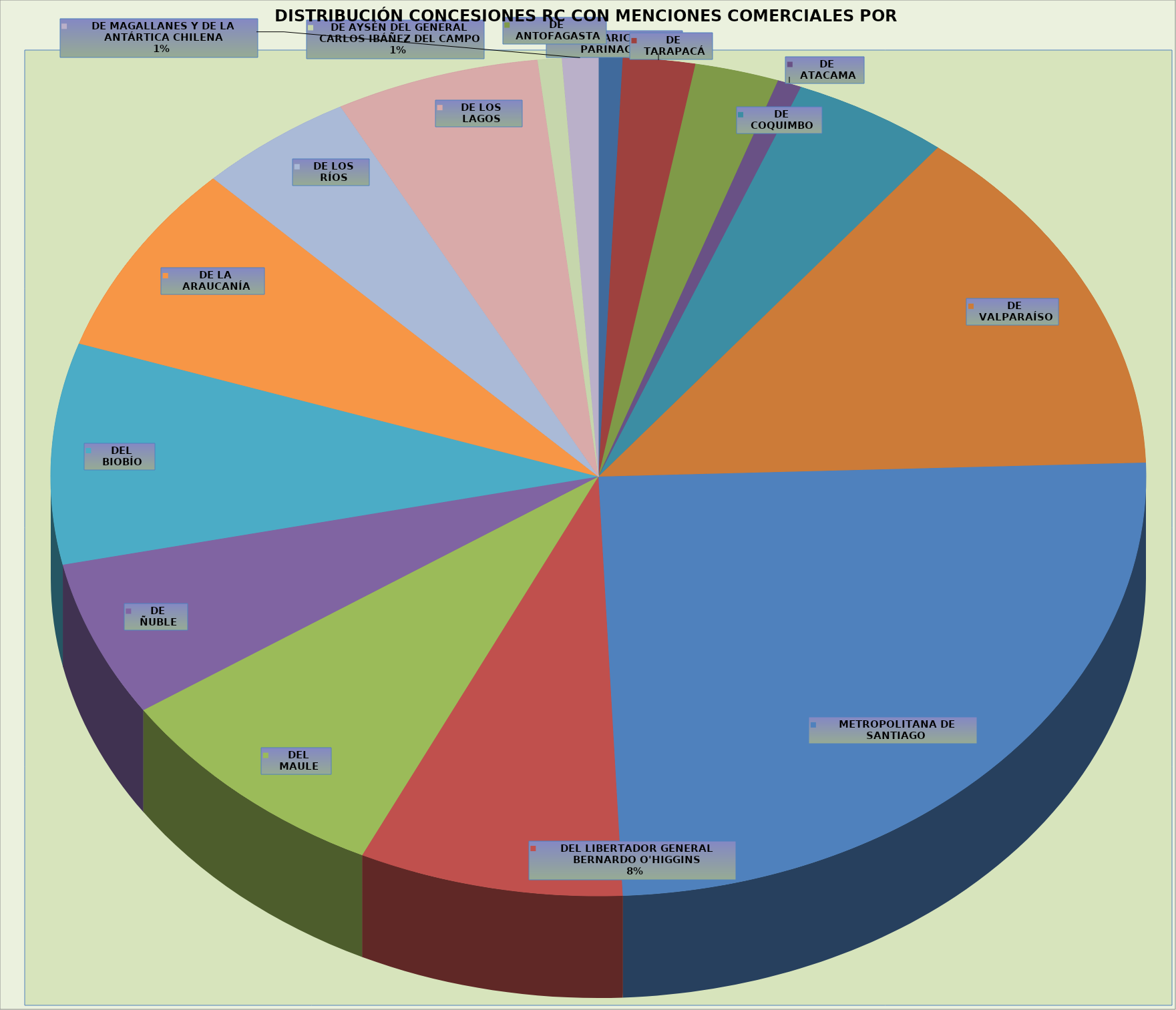
| Category | Total |
|---|---|
| DE ARICA Y PARINACOTA | 2 |
| DE TARAPACÁ | 6 |
| DE ANTOFAGASTA | 7 |
| DE ATACAMA | 2 |
| DE COQUIMBO | 13 |
| DE VALPARAÍSO | 39 |
| METROPOLITANA DE SANTIAGO | 70 |
| DEL LIBERTADOR GENERAL BERNARDO O'HIGGINS | 22 |
| DEL MAULE | 24 |
| DE ÑUBLE | 17 |
| DEL BIOBÍO | 24 |
| DE LA ARAUCANÍA | 21 |
| DE LOS RÍOS | 13 |
| DE LOS LAGOS | 17 |
| DE AYSÉN DEL GENERAL CARLOS IBÁÑEZ DEL CAMPO | 2 |
| DE MAGALLANES Y DE LA ANTÁRTICA CHILENA | 3 |